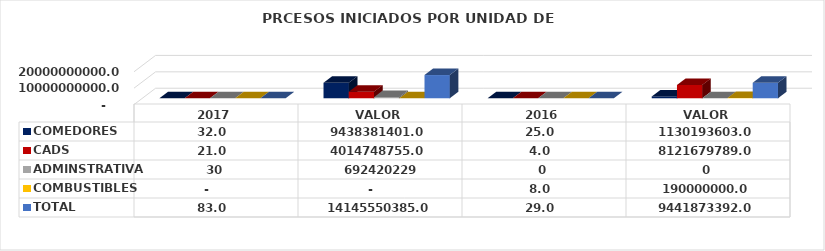
| Category | COMEDORES | CADS | ADMINSTRATIVA | COMBUSTIBLES | TOTAL |
|---|---|---|---|---|---|
| VALOR | 9438381401 | 4014748755 | 692420229 | 0 | 14145550385 |
| VALOR | 1130193603 | 8121679789 | 0 | 190000000 | 9441873392 |